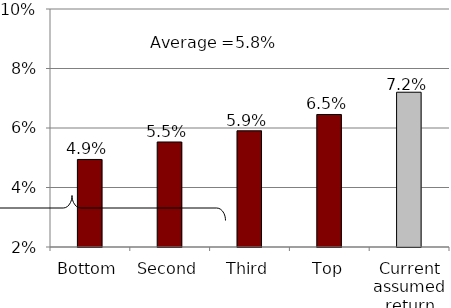
| Category | Series 0 |
|---|---|
| Bottom | 0.049 |
| Second | 0.055 |
| Third | 0.059 |
| Top | 0.065 |
| Current assumed return | 0.072 |